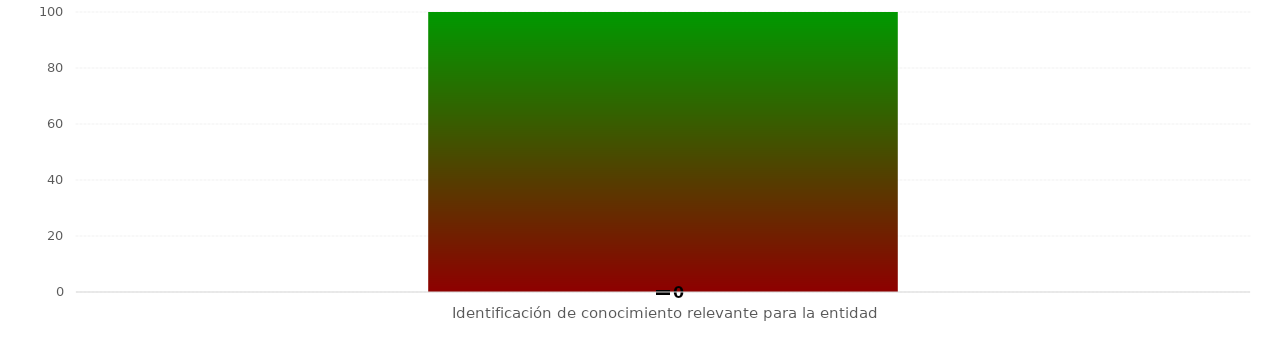
| Category | Niveles |
|---|---|
| Identificación de conocimiento relevante para la entidad | 100 |